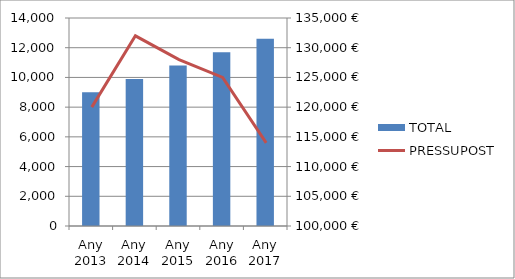
| Category | TOTAL |
|---|---|
| Any 2013 | 9000 |
| Any 2014 | 9900 |
| Any 2015 | 10800 |
| Any 2016 | 11700 |
| Any 2017 | 12600 |